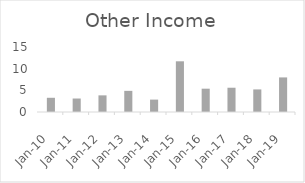
| Category |  Other Income  |
|---|---|
| 2010-03-31 | 3.28 |
| 2011-03-31 | 3.11 |
| 2012-03-31 | 3.84 |
| 2013-03-31 | 4.88 |
| 2014-03-31 | 2.86 |
| 2015-03-31 | 11.7 |
| 2016-03-31 | 5.38 |
| 2017-03-31 | 5.6 |
| 2018-03-31 | 5.21 |
| 2019-03-31 | 7.98 |